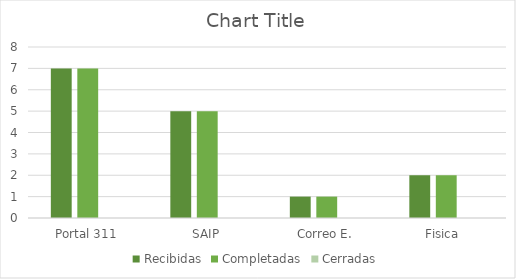
| Category | Recibidas | Completadas | Cerradas |
|---|---|---|---|
| Portal 311 | 7 | 7 | 0 |
| SAIP | 5 | 5 | 0 |
| Correo E. | 1 | 1 | 0 |
| Fisica  | 2 | 2 | 0 |